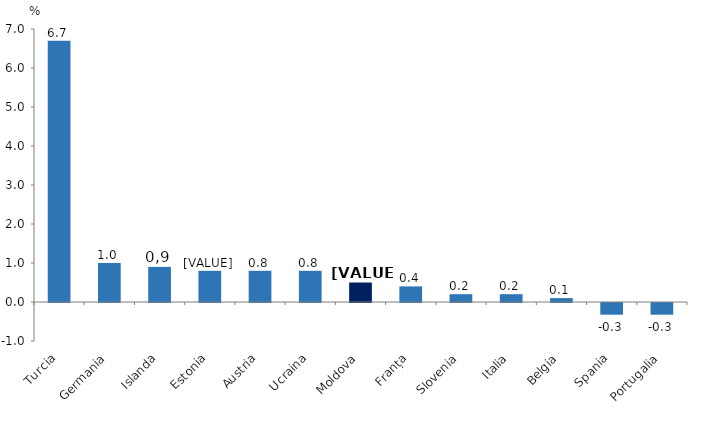
| Category | Series 0 |
|---|---|
| Turcia | 6.7 |
| Germania | 1 |
| Islanda | 0.9 |
| Estonia | 0.8 |
| Austria | 0.8 |
| Ucraina | 0.8 |
| Moldova | 0.5 |
| Franța | 0.4 |
| Slovenia | 0.2 |
| Italia | 0.2 |
| Belgia | 0.1 |
| Spania | -0.3 |
| Portugalia | -0.3 |